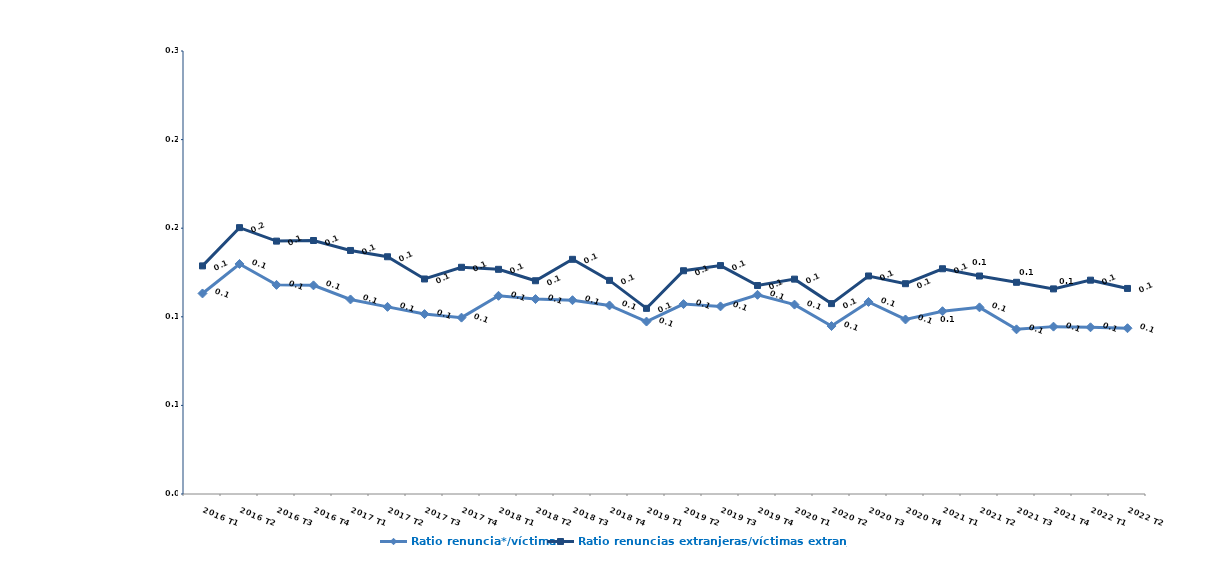
| Category | Ratio renuncia*/víctima | Ratio renuncias extranjeras/víctimas extranjeras |
|---|---|---|
| 2016 T1 | 0.113 | 0.129 |
| 2016 T2 | 0.13 | 0.15 |
| 2016 T3 | 0.118 | 0.143 |
| 2016 T4 | 0.118 | 0.143 |
| 2017 T1 | 0.11 | 0.137 |
| 2017 T2 | 0.106 | 0.134 |
| 2017 T3 | 0.102 | 0.121 |
| 2017 T4 | 0.1 | 0.128 |
| 2018 T1 | 0.112 | 0.127 |
| 2018 T2 | 0.11 | 0.12 |
| 2018 T3 | 0.109 | 0.132 |
| 2018 T4 | 0.106 | 0.121 |
| 2019 T1 | 0.097 | 0.105 |
| 2019 T2 | 0.107 | 0.126 |
| 2019 T3 | 0.106 | 0.129 |
| 2019 T4 | 0.112 | 0.118 |
| 2020 T1 | 0.107 | 0.121 |
| 2020 T2 | 0.095 | 0.107 |
| 2020 T3 | 0.108 | 0.123 |
| 2020 T4 | 0.098 | 0.119 |
| 2021 T1 | 0.103 | 0.127 |
| 2021 T2 | 0.105 | 0.123 |
| 2021 T3 | 0.093 | 0.119 |
| 2021 T4 | 0.094 | 0.116 |
| 2022 T1 | 0.094 | 0.121 |
| 2022 T2 | 0.094 | 0.116 |